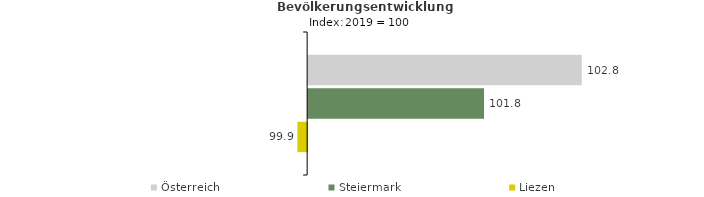
| Category | Österreich | Steiermark | Liezen |
|---|---|---|---|
| 2023.0 | 102.8 | 101.8 | 99.9 |